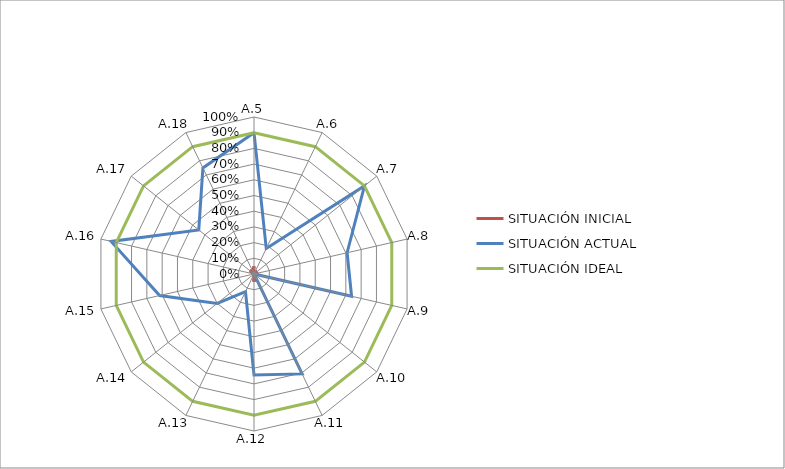
| Category | SITUACIÓN INICIAL | SITUACIÓN ACTUAL | SITUACIÓN IDEAL |
|---|---|---|---|
| A.5 | 0.05 | 0.9 | 0.9 |
| A.6 | 0 | 0.18 | 0.9 |
| A.7 | 0.028 | 0.9 | 0.9 |
| A.8 | 0 | 0.608 | 0.9 |
| A.9 | 0.03 | 0.638 | 0.9 |
| A.10 | 0 | 0 | 0.9 |
| A.11 | 0.014 | 0.706 | 0.9 |
| A.12 | 0.05 | 0.643 | 0.9 |
| A.13 | 0 | 0.125 | 0.9 |
| A.14 | 0 | 0.3 | 0.9 |
| A.15 | 0 | 0.617 | 0.9 |
| A.16 | 0 | 0.933 | 0.9 |
| A.17 | 0.033 | 0.45 | 0.9 |
| A.18 | 0.017 | 0.75 | 0.9 |